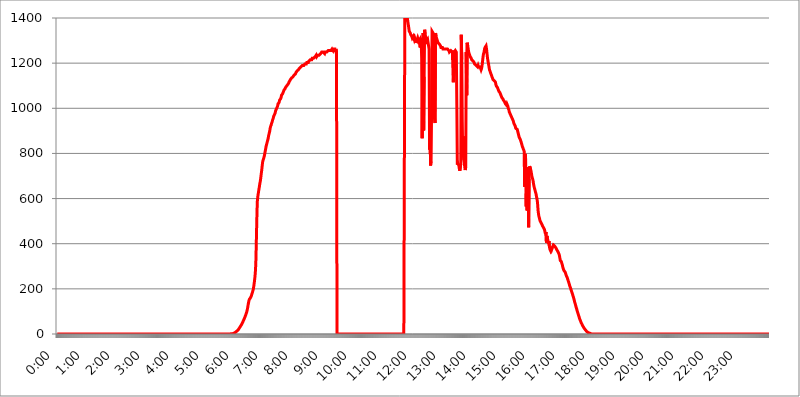
| Category | 2015.03.06. Intenzitás [W/m^2] |
|---|---|
| 0.0 | -0.256 |
| 0.0006944444444444445 | -0.256 |
| 0.001388888888888889 | -0.256 |
| 0.0020833333333333333 | -0.256 |
| 0.002777777777777778 | -0.256 |
| 0.003472222222222222 | -0.256 |
| 0.004166666666666667 | -0.256 |
| 0.004861111111111111 | -0.256 |
| 0.005555555555555556 | -0.256 |
| 0.0062499999999999995 | -0.256 |
| 0.006944444444444444 | -0.256 |
| 0.007638888888888889 | -0.256 |
| 0.008333333333333333 | -0.256 |
| 0.009027777777777779 | -0.256 |
| 0.009722222222222222 | -0.256 |
| 0.010416666666666666 | -0.256 |
| 0.011111111111111112 | -0.256 |
| 0.011805555555555555 | -0.256 |
| 0.012499999999999999 | -0.256 |
| 0.013194444444444444 | -0.256 |
| 0.013888888888888888 | -0.256 |
| 0.014583333333333332 | -0.256 |
| 0.015277777777777777 | -0.256 |
| 0.015972222222222224 | -0.256 |
| 0.016666666666666666 | -0.256 |
| 0.017361111111111112 | -0.256 |
| 0.018055555555555557 | -0.256 |
| 0.01875 | -0.256 |
| 0.019444444444444445 | -0.256 |
| 0.02013888888888889 | -0.256 |
| 0.020833333333333332 | -0.256 |
| 0.02152777777777778 | -0.256 |
| 0.022222222222222223 | -0.256 |
| 0.02291666666666667 | -0.256 |
| 0.02361111111111111 | -0.256 |
| 0.024305555555555556 | -0.256 |
| 0.024999999999999998 | -0.256 |
| 0.025694444444444447 | -0.256 |
| 0.02638888888888889 | -0.256 |
| 0.027083333333333334 | -0.256 |
| 0.027777777777777776 | -0.256 |
| 0.02847222222222222 | -0.256 |
| 0.029166666666666664 | -0.256 |
| 0.029861111111111113 | -0.256 |
| 0.030555555555555555 | -0.256 |
| 0.03125 | -0.256 |
| 0.03194444444444445 | -0.256 |
| 0.03263888888888889 | -0.256 |
| 0.03333333333333333 | -0.256 |
| 0.034027777777777775 | -0.256 |
| 0.034722222222222224 | -0.256 |
| 0.035416666666666666 | -0.256 |
| 0.036111111111111115 | -0.256 |
| 0.03680555555555556 | -0.256 |
| 0.0375 | -0.256 |
| 0.03819444444444444 | -0.256 |
| 0.03888888888888889 | -0.256 |
| 0.03958333333333333 | -0.256 |
| 0.04027777777777778 | -0.256 |
| 0.04097222222222222 | -0.256 |
| 0.041666666666666664 | -0.256 |
| 0.042361111111111106 | -0.256 |
| 0.04305555555555556 | -0.256 |
| 0.043750000000000004 | -0.256 |
| 0.044444444444444446 | -0.256 |
| 0.04513888888888889 | -0.256 |
| 0.04583333333333334 | -0.256 |
| 0.04652777777777778 | -0.256 |
| 0.04722222222222222 | -0.256 |
| 0.04791666666666666 | -0.256 |
| 0.04861111111111111 | -0.256 |
| 0.049305555555555554 | -0.256 |
| 0.049999999999999996 | -0.256 |
| 0.05069444444444445 | -0.256 |
| 0.051388888888888894 | -0.256 |
| 0.052083333333333336 | -0.256 |
| 0.05277777777777778 | -0.256 |
| 0.05347222222222222 | -0.256 |
| 0.05416666666666667 | -0.256 |
| 0.05486111111111111 | -0.256 |
| 0.05555555555555555 | -0.256 |
| 0.05625 | -0.256 |
| 0.05694444444444444 | -0.256 |
| 0.057638888888888885 | -0.256 |
| 0.05833333333333333 | -0.256 |
| 0.05902777777777778 | -0.256 |
| 0.059722222222222225 | -0.256 |
| 0.06041666666666667 | -0.256 |
| 0.061111111111111116 | -0.256 |
| 0.06180555555555556 | -0.256 |
| 0.0625 | -0.256 |
| 0.06319444444444444 | -0.256 |
| 0.06388888888888888 | -0.256 |
| 0.06458333333333334 | -0.256 |
| 0.06527777777777778 | -0.256 |
| 0.06597222222222222 | -0.256 |
| 0.06666666666666667 | -0.256 |
| 0.06736111111111111 | -0.256 |
| 0.06805555555555555 | -0.256 |
| 0.06874999999999999 | -0.256 |
| 0.06944444444444443 | -0.256 |
| 0.07013888888888889 | -0.256 |
| 0.07083333333333333 | -0.256 |
| 0.07152777777777779 | -0.256 |
| 0.07222222222222223 | -0.256 |
| 0.07291666666666667 | -0.256 |
| 0.07361111111111111 | -0.256 |
| 0.07430555555555556 | -0.256 |
| 0.075 | -0.256 |
| 0.07569444444444444 | -0.256 |
| 0.0763888888888889 | -0.256 |
| 0.07708333333333334 | -0.256 |
| 0.07777777777777778 | -0.256 |
| 0.07847222222222222 | -0.256 |
| 0.07916666666666666 | -0.256 |
| 0.0798611111111111 | -0.256 |
| 0.08055555555555556 | -0.256 |
| 0.08125 | -0.256 |
| 0.08194444444444444 | -0.256 |
| 0.08263888888888889 | -0.256 |
| 0.08333333333333333 | -0.256 |
| 0.08402777777777777 | -0.256 |
| 0.08472222222222221 | -0.256 |
| 0.08541666666666665 | -0.256 |
| 0.08611111111111112 | -0.256 |
| 0.08680555555555557 | -0.256 |
| 0.08750000000000001 | -0.256 |
| 0.08819444444444445 | -0.256 |
| 0.08888888888888889 | -0.256 |
| 0.08958333333333333 | -0.256 |
| 0.09027777777777778 | -0.256 |
| 0.09097222222222222 | -0.256 |
| 0.09166666666666667 | -0.256 |
| 0.09236111111111112 | -0.256 |
| 0.09305555555555556 | -0.256 |
| 0.09375 | -0.256 |
| 0.09444444444444444 | -0.256 |
| 0.09513888888888888 | -0.256 |
| 0.09583333333333333 | -0.256 |
| 0.09652777777777777 | -0.256 |
| 0.09722222222222222 | -0.256 |
| 0.09791666666666667 | -0.256 |
| 0.09861111111111111 | -0.256 |
| 0.09930555555555555 | -0.256 |
| 0.09999999999999999 | -0.256 |
| 0.10069444444444443 | -0.256 |
| 0.1013888888888889 | -0.256 |
| 0.10208333333333335 | -0.256 |
| 0.10277777777777779 | -0.256 |
| 0.10347222222222223 | -0.256 |
| 0.10416666666666667 | -0.256 |
| 0.10486111111111111 | -0.256 |
| 0.10555555555555556 | -0.256 |
| 0.10625 | -0.256 |
| 0.10694444444444444 | -0.256 |
| 0.1076388888888889 | -0.256 |
| 0.10833333333333334 | -0.256 |
| 0.10902777777777778 | -0.256 |
| 0.10972222222222222 | -0.256 |
| 0.1111111111111111 | -0.256 |
| 0.11180555555555556 | -0.256 |
| 0.11180555555555556 | -0.256 |
| 0.1125 | -0.256 |
| 0.11319444444444444 | -0.256 |
| 0.11388888888888889 | -0.256 |
| 0.11458333333333333 | -0.256 |
| 0.11527777777777777 | -0.256 |
| 0.11597222222222221 | -0.256 |
| 0.11666666666666665 | -0.256 |
| 0.1173611111111111 | -0.256 |
| 0.11805555555555557 | -0.256 |
| 0.11944444444444445 | -0.256 |
| 0.12013888888888889 | -0.256 |
| 0.12083333333333333 | -0.256 |
| 0.12152777777777778 | -0.256 |
| 0.12222222222222223 | -0.256 |
| 0.12291666666666667 | -0.256 |
| 0.12291666666666667 | -0.256 |
| 0.12361111111111112 | -0.256 |
| 0.12430555555555556 | -0.256 |
| 0.125 | -0.256 |
| 0.12569444444444444 | -0.256 |
| 0.12638888888888888 | -0.256 |
| 0.12708333333333333 | -0.256 |
| 0.16875 | -0.256 |
| 0.12847222222222224 | -0.256 |
| 0.12916666666666668 | -0.256 |
| 0.12986111111111112 | -0.256 |
| 0.13055555555555556 | -0.256 |
| 0.13125 | -0.256 |
| 0.13194444444444445 | -0.256 |
| 0.1326388888888889 | -0.256 |
| 0.13333333333333333 | -0.256 |
| 0.13402777777777777 | -0.256 |
| 0.13402777777777777 | -0.256 |
| 0.13472222222222222 | -0.256 |
| 0.13541666666666666 | -0.256 |
| 0.1361111111111111 | -0.256 |
| 0.13749999999999998 | -0.256 |
| 0.13819444444444443 | -0.256 |
| 0.1388888888888889 | -0.256 |
| 0.13958333333333334 | -0.256 |
| 0.14027777777777778 | -0.256 |
| 0.14097222222222222 | -0.256 |
| 0.14166666666666666 | -0.256 |
| 0.1423611111111111 | -0.256 |
| 0.14305555555555557 | -0.256 |
| 0.14375000000000002 | -0.256 |
| 0.14444444444444446 | -0.256 |
| 0.1451388888888889 | -0.256 |
| 0.1451388888888889 | -0.256 |
| 0.14652777777777778 | -0.256 |
| 0.14722222222222223 | -0.256 |
| 0.14791666666666667 | -0.256 |
| 0.1486111111111111 | -0.256 |
| 0.14930555555555555 | -0.256 |
| 0.15 | -0.256 |
| 0.15069444444444444 | -0.256 |
| 0.15138888888888888 | -0.256 |
| 0.15208333333333332 | -0.256 |
| 0.15277777777777776 | -0.256 |
| 0.15347222222222223 | -0.256 |
| 0.15416666666666667 | -0.256 |
| 0.15486111111111112 | -0.256 |
| 0.15555555555555556 | -0.256 |
| 0.15625 | -0.256 |
| 0.15694444444444444 | -0.256 |
| 0.15763888888888888 | -0.256 |
| 0.15833333333333333 | -0.256 |
| 0.15902777777777777 | -0.256 |
| 0.15972222222222224 | -0.256 |
| 0.16041666666666668 | -0.256 |
| 0.16111111111111112 | -0.256 |
| 0.16180555555555556 | -0.256 |
| 0.1625 | -0.256 |
| 0.16319444444444445 | -0.256 |
| 0.1638888888888889 | -0.256 |
| 0.16458333333333333 | -0.256 |
| 0.16527777777777777 | -0.256 |
| 0.16597222222222222 | -0.256 |
| 0.16666666666666666 | -0.256 |
| 0.1673611111111111 | -0.256 |
| 0.16805555555555554 | -0.256 |
| 0.16874999999999998 | -0.256 |
| 0.16944444444444443 | -0.256 |
| 0.17013888888888887 | -0.256 |
| 0.1708333333333333 | -0.256 |
| 0.17152777777777775 | -0.256 |
| 0.17222222222222225 | -0.256 |
| 0.1729166666666667 | -0.256 |
| 0.17361111111111113 | -0.256 |
| 0.17430555555555557 | -0.256 |
| 0.17500000000000002 | -0.256 |
| 0.17569444444444446 | -0.256 |
| 0.1763888888888889 | -0.256 |
| 0.17708333333333334 | -0.256 |
| 0.17777777777777778 | -0.256 |
| 0.17847222222222223 | -0.256 |
| 0.17916666666666667 | -0.256 |
| 0.1798611111111111 | -0.256 |
| 0.18055555555555555 | -0.256 |
| 0.18125 | -0.256 |
| 0.18194444444444444 | -0.256 |
| 0.1826388888888889 | -0.256 |
| 0.18333333333333335 | -0.256 |
| 0.1840277777777778 | -0.256 |
| 0.18472222222222223 | -0.256 |
| 0.18541666666666667 | -0.256 |
| 0.18611111111111112 | -0.256 |
| 0.18680555555555556 | -0.256 |
| 0.1875 | -0.256 |
| 0.18819444444444444 | -0.256 |
| 0.18888888888888888 | -0.256 |
| 0.18958333333333333 | -0.256 |
| 0.19027777777777777 | -0.256 |
| 0.1909722222222222 | -0.256 |
| 0.19166666666666665 | -0.256 |
| 0.19236111111111112 | -0.256 |
| 0.19305555555555554 | -0.256 |
| 0.19375 | -0.256 |
| 0.19444444444444445 | -0.256 |
| 0.1951388888888889 | -0.256 |
| 0.19583333333333333 | -0.256 |
| 0.19652777777777777 | -0.256 |
| 0.19722222222222222 | -0.256 |
| 0.19791666666666666 | -0.256 |
| 0.1986111111111111 | -0.256 |
| 0.19930555555555554 | -0.256 |
| 0.19999999999999998 | -0.256 |
| 0.20069444444444443 | -0.256 |
| 0.20138888888888887 | -0.256 |
| 0.2020833333333333 | -0.256 |
| 0.2027777777777778 | -0.256 |
| 0.2034722222222222 | -0.256 |
| 0.2041666666666667 | -0.256 |
| 0.20486111111111113 | -0.256 |
| 0.20555555555555557 | -0.256 |
| 0.20625000000000002 | -0.256 |
| 0.20694444444444446 | -0.256 |
| 0.2076388888888889 | -0.256 |
| 0.20833333333333334 | -0.256 |
| 0.20902777777777778 | -0.256 |
| 0.20972222222222223 | -0.256 |
| 0.21041666666666667 | -0.256 |
| 0.2111111111111111 | -0.256 |
| 0.21180555555555555 | -0.256 |
| 0.2125 | -0.256 |
| 0.21319444444444444 | -0.256 |
| 0.2138888888888889 | -0.256 |
| 0.21458333333333335 | -0.256 |
| 0.2152777777777778 | -0.256 |
| 0.21597222222222223 | -0.256 |
| 0.21666666666666667 | -0.256 |
| 0.21736111111111112 | -0.256 |
| 0.21805555555555556 | -0.256 |
| 0.21875 | -0.256 |
| 0.21944444444444444 | -0.256 |
| 0.22013888888888888 | -0.256 |
| 0.22083333333333333 | -0.256 |
| 0.22152777777777777 | -0.256 |
| 0.2222222222222222 | -0.256 |
| 0.22291666666666665 | -0.256 |
| 0.2236111111111111 | -0.256 |
| 0.22430555555555556 | -0.256 |
| 0.225 | -0.256 |
| 0.22569444444444445 | -0.256 |
| 0.2263888888888889 | -0.256 |
| 0.22708333333333333 | -0.256 |
| 0.22777777777777777 | -0.256 |
| 0.22847222222222222 | -0.256 |
| 0.22916666666666666 | -0.256 |
| 0.2298611111111111 | -0.256 |
| 0.23055555555555554 | -0.256 |
| 0.23124999999999998 | -0.256 |
| 0.23194444444444443 | -0.256 |
| 0.23263888888888887 | -0.256 |
| 0.2333333333333333 | -0.256 |
| 0.2340277777777778 | -0.256 |
| 0.2347222222222222 | -0.256 |
| 0.2354166666666667 | -0.256 |
| 0.23611111111111113 | -0.256 |
| 0.23680555555555557 | -0.256 |
| 0.23750000000000002 | -0.256 |
| 0.23819444444444446 | -0.256 |
| 0.2388888888888889 | -0.256 |
| 0.23958333333333334 | -0.256 |
| 0.24027777777777778 | -0.256 |
| 0.24097222222222223 | -0.256 |
| 0.24166666666666667 | -0.256 |
| 0.2423611111111111 | -0.256 |
| 0.24305555555555555 | -0.256 |
| 0.24375 | 1.09 |
| 0.24444444444444446 | 1.09 |
| 0.24513888888888888 | 1.09 |
| 0.24583333333333335 | 1.09 |
| 0.2465277777777778 | 2.439 |
| 0.24722222222222223 | 2.439 |
| 0.24791666666666667 | 3.791 |
| 0.24861111111111112 | 5.146 |
| 0.24930555555555556 | 6.503 |
| 0.25 | 7.862 |
| 0.25069444444444444 | 9.225 |
| 0.2513888888888889 | 10.589 |
| 0.2520833333333333 | 13.325 |
| 0.25277777777777777 | 14.696 |
| 0.2534722222222222 | 17.444 |
| 0.25416666666666665 | 20.201 |
| 0.2548611111111111 | 22.965 |
| 0.2555555555555556 | 27.124 |
| 0.25625000000000003 | 29.905 |
| 0.2569444444444445 | 34.086 |
| 0.2576388888888889 | 36.881 |
| 0.25833333333333336 | 41.081 |
| 0.2590277777777778 | 45.29 |
| 0.25972222222222224 | 49.507 |
| 0.2604166666666667 | 53.73 |
| 0.2611111111111111 | 59.368 |
| 0.26180555555555557 | 63.6 |
| 0.2625 | 69.246 |
| 0.26319444444444445 | 74.892 |
| 0.2638888888888889 | 80.536 |
| 0.26458333333333334 | 86.175 |
| 0.2652777777777778 | 93.212 |
| 0.2659722222222222 | 100.233 |
| 0.26666666666666666 | 110.025 |
| 0.2673611111111111 | 122.538 |
| 0.26805555555555555 | 134.943 |
| 0.26875 | 145.865 |
| 0.26944444444444443 | 153.986 |
| 0.2701388888888889 | 156.678 |
| 0.2708333333333333 | 159.364 |
| 0.27152777777777776 | 162.042 |
| 0.2722222222222222 | 168.703 |
| 0.27291666666666664 | 176.631 |
| 0.2736111111111111 | 183.184 |
| 0.2743055555555555 | 190.979 |
| 0.27499999999999997 | 198.701 |
| 0.27569444444444446 | 212.664 |
| 0.27638888888888885 | 228.852 |
| 0.27708333333333335 | 247.131 |
| 0.2777777777777778 | 270.931 |
| 0.27847222222222223 | 310.439 |
| 0.2791666666666667 | 400.943 |
| 0.2798611111111111 | 502.396 |
| 0.28055555555555556 | 585.562 |
| 0.28125 | 607.495 |
| 0.28194444444444444 | 622.881 |
| 0.2826388888888889 | 636.194 |
| 0.2833333333333333 | 649.973 |
| 0.28402777777777777 | 664.234 |
| 0.2847222222222222 | 676.003 |
| 0.28541666666666665 | 691.18 |
| 0.28611111111111115 | 710.098 |
| 0.28680555555555554 | 726.474 |
| 0.28750000000000003 | 746.886 |
| 0.2881944444444445 | 764.555 |
| 0.2888888888888889 | 771.794 |
| 0.28958333333333336 | 779.134 |
| 0.2902777777777778 | 786.575 |
| 0.29097222222222224 | 797.931 |
| 0.2916666666666667 | 809.522 |
| 0.2923611111111111 | 821.353 |
| 0.29305555555555557 | 833.43 |
| 0.29375 | 837.51 |
| 0.29444444444444445 | 849.92 |
| 0.2951388888888889 | 858.335 |
| 0.29583333333333334 | 866.865 |
| 0.2965277777777778 | 879.878 |
| 0.2972222222222222 | 888.701 |
| 0.29791666666666666 | 897.643 |
| 0.2986111111111111 | 911.285 |
| 0.29930555555555555 | 920.533 |
| 0.3 | 925.203 |
| 0.30069444444444443 | 934.639 |
| 0.3013888888888889 | 939.404 |
| 0.3020833333333333 | 949.03 |
| 0.30277777777777776 | 953.892 |
| 0.3034722222222222 | 963.712 |
| 0.30416666666666664 | 968.671 |
| 0.3048611111111111 | 973.663 |
| 0.3055555555555555 | 978.688 |
| 0.30624999999999997 | 988.839 |
| 0.3069444444444444 | 993.965 |
| 0.3076388888888889 | 999.125 |
| 0.30833333333333335 | 1004.318 |
| 0.3090277777777778 | 1009.546 |
| 0.30972222222222223 | 1020.106 |
| 0.3104166666666667 | 1020.106 |
| 0.3111111111111111 | 1025.437 |
| 0.31180555555555556 | 1036.206 |
| 0.3125 | 1036.206 |
| 0.31319444444444444 | 1041.644 |
| 0.3138888888888889 | 1047.117 |
| 0.3145833333333333 | 1058.17 |
| 0.31527777777777777 | 1058.17 |
| 0.3159722222222222 | 1063.751 |
| 0.31666666666666665 | 1069.368 |
| 0.31736111111111115 | 1075.021 |
| 0.31805555555555554 | 1080.711 |
| 0.31875000000000003 | 1080.711 |
| 0.3194444444444445 | 1086.439 |
| 0.3201388888888889 | 1092.203 |
| 0.32083333333333336 | 1092.203 |
| 0.3215277777777778 | 1098.004 |
| 0.32222222222222224 | 1098.004 |
| 0.3229166666666667 | 1103.843 |
| 0.3236111111111111 | 1103.843 |
| 0.32430555555555557 | 1109.72 |
| 0.325 | 1115.634 |
| 0.32569444444444445 | 1115.634 |
| 0.3263888888888889 | 1115.634 |
| 0.32708333333333334 | 1127.578 |
| 0.3277777777777778 | 1127.578 |
| 0.3284722222222222 | 1133.607 |
| 0.32916666666666666 | 1133.607 |
| 0.3298611111111111 | 1133.607 |
| 0.33055555555555555 | 1139.675 |
| 0.33125 | 1139.675 |
| 0.33194444444444443 | 1145.782 |
| 0.3326388888888889 | 1145.782 |
| 0.3333333333333333 | 1145.782 |
| 0.3340277777777778 | 1151.928 |
| 0.3347222222222222 | 1158.113 |
| 0.3354166666666667 | 1158.113 |
| 0.3361111111111111 | 1164.337 |
| 0.3368055555555556 | 1164.337 |
| 0.33749999999999997 | 1164.337 |
| 0.33819444444444446 | 1170.601 |
| 0.33888888888888885 | 1170.601 |
| 0.33958333333333335 | 1176.905 |
| 0.34027777777777773 | 1176.905 |
| 0.34097222222222223 | 1176.905 |
| 0.3416666666666666 | 1183.249 |
| 0.3423611111111111 | 1183.249 |
| 0.3430555555555555 | 1183.249 |
| 0.34375 | 1189.633 |
| 0.3444444444444445 | 1189.633 |
| 0.3451388888888889 | 1189.633 |
| 0.3458333333333334 | 1189.633 |
| 0.34652777777777777 | 1189.633 |
| 0.34722222222222227 | 1196.058 |
| 0.34791666666666665 | 1196.058 |
| 0.34861111111111115 | 1196.058 |
| 0.34930555555555554 | 1196.058 |
| 0.35000000000000003 | 1202.523 |
| 0.3506944444444444 | 1202.523 |
| 0.3513888888888889 | 1202.523 |
| 0.3520833333333333 | 1202.523 |
| 0.3527777777777778 | 1209.029 |
| 0.3534722222222222 | 1209.029 |
| 0.3541666666666667 | 1209.029 |
| 0.3548611111111111 | 1215.576 |
| 0.35555555555555557 | 1215.576 |
| 0.35625 | 1215.576 |
| 0.35694444444444445 | 1215.576 |
| 0.3576388888888889 | 1222.164 |
| 0.35833333333333334 | 1222.164 |
| 0.3590277777777778 | 1222.164 |
| 0.3597222222222222 | 1222.164 |
| 0.36041666666666666 | 1222.164 |
| 0.3611111111111111 | 1222.164 |
| 0.36180555555555555 | 1228.794 |
| 0.3625 | 1228.794 |
| 0.36319444444444443 | 1235.465 |
| 0.3638888888888889 | 1228.794 |
| 0.3645833333333333 | 1228.794 |
| 0.3652777777777778 | 1235.465 |
| 0.3659722222222222 | 1235.465 |
| 0.3666666666666667 | 1235.465 |
| 0.3673611111111111 | 1235.465 |
| 0.3680555555555556 | 1235.465 |
| 0.36874999999999997 | 1235.465 |
| 0.36944444444444446 | 1242.179 |
| 0.37013888888888885 | 1242.179 |
| 0.37083333333333335 | 1248.934 |
| 0.37152777777777773 | 1248.934 |
| 0.37222222222222223 | 1248.934 |
| 0.3729166666666666 | 1248.934 |
| 0.3736111111111111 | 1248.934 |
| 0.3743055555555555 | 1248.934 |
| 0.375 | 1242.179 |
| 0.3756944444444445 | 1248.934 |
| 0.3763888888888889 | 1248.934 |
| 0.3770833333333334 | 1248.934 |
| 0.37777777777777777 | 1248.934 |
| 0.37847222222222227 | 1248.934 |
| 0.37916666666666665 | 1248.934 |
| 0.37986111111111115 | 1255.731 |
| 0.38055555555555554 | 1255.731 |
| 0.38125000000000003 | 1255.731 |
| 0.3819444444444444 | 1255.731 |
| 0.3826388888888889 | 1255.731 |
| 0.3833333333333333 | 1255.731 |
| 0.3840277777777778 | 1255.731 |
| 0.3847222222222222 | 1255.731 |
| 0.3854166666666667 | 1262.571 |
| 0.3861111111111111 | 1262.571 |
| 0.38680555555555557 | 1255.731 |
| 0.3875 | 1262.571 |
| 0.38819444444444445 | 1262.571 |
| 0.3888888888888889 | 1262.571 |
| 0.38958333333333334 | 1262.571 |
| 0.3902777777777778 | 1255.731 |
| 0.3909722222222222 | 1262.571 |
| 0.39166666666666666 | 1248.934 |
| 0.3923611111111111 | -0.256 |
| 0.39305555555555555 | -0.256 |
| 0.39375 | -0.256 |
| 0.39444444444444443 | -0.256 |
| 0.3951388888888889 | -0.256 |
| 0.3958333333333333 | -0.256 |
| 0.3965277777777778 | -0.256 |
| 0.3972222222222222 | -0.256 |
| 0.3979166666666667 | -0.256 |
| 0.3986111111111111 | -0.256 |
| 0.3993055555555556 | -0.256 |
| 0.39999999999999997 | -0.256 |
| 0.40069444444444446 | -0.256 |
| 0.40138888888888885 | -0.256 |
| 0.40208333333333335 | -0.256 |
| 0.40277777777777773 | -0.256 |
| 0.40347222222222223 | -0.256 |
| 0.4041666666666666 | -0.256 |
| 0.4048611111111111 | -0.256 |
| 0.4055555555555555 | -0.256 |
| 0.40625 | -0.256 |
| 0.4069444444444445 | -0.256 |
| 0.4076388888888889 | -0.256 |
| 0.4083333333333334 | -0.256 |
| 0.40902777777777777 | -0.256 |
| 0.40972222222222227 | -0.256 |
| 0.41041666666666665 | -0.256 |
| 0.41111111111111115 | -0.256 |
| 0.41180555555555554 | -0.256 |
| 0.41250000000000003 | -0.256 |
| 0.4131944444444444 | -0.256 |
| 0.4138888888888889 | -0.256 |
| 0.4145833333333333 | -0.256 |
| 0.4152777777777778 | -0.256 |
| 0.4159722222222222 | -0.256 |
| 0.4166666666666667 | -0.256 |
| 0.4173611111111111 | -0.256 |
| 0.41805555555555557 | -0.256 |
| 0.41875 | -0.256 |
| 0.41944444444444445 | -0.256 |
| 0.4201388888888889 | -0.256 |
| 0.42083333333333334 | -0.256 |
| 0.4215277777777778 | -0.256 |
| 0.4222222222222222 | -0.256 |
| 0.42291666666666666 | -0.256 |
| 0.4236111111111111 | -0.256 |
| 0.42430555555555555 | -0.256 |
| 0.425 | -0.256 |
| 0.42569444444444443 | -0.256 |
| 0.4263888888888889 | -0.256 |
| 0.4270833333333333 | -0.256 |
| 0.4277777777777778 | -0.256 |
| 0.4284722222222222 | -0.256 |
| 0.4291666666666667 | -0.256 |
| 0.4298611111111111 | -0.256 |
| 0.4305555555555556 | -0.256 |
| 0.43124999999999997 | -0.256 |
| 0.43194444444444446 | -0.256 |
| 0.43263888888888885 | -0.256 |
| 0.43333333333333335 | -0.256 |
| 0.43402777777777773 | -0.256 |
| 0.43472222222222223 | -0.256 |
| 0.4354166666666666 | -0.256 |
| 0.4361111111111111 | -0.256 |
| 0.4368055555555555 | -0.256 |
| 0.4375 | -0.256 |
| 0.4381944444444445 | -0.256 |
| 0.4388888888888889 | -0.256 |
| 0.4395833333333334 | -0.256 |
| 0.44027777777777777 | -0.256 |
| 0.44097222222222227 | -0.256 |
| 0.44166666666666665 | -0.256 |
| 0.44236111111111115 | -0.256 |
| 0.44305555555555554 | -0.256 |
| 0.44375000000000003 | -0.256 |
| 0.4444444444444444 | -0.256 |
| 0.4451388888888889 | -0.256 |
| 0.4458333333333333 | -0.256 |
| 0.4465277777777778 | -0.256 |
| 0.4472222222222222 | -0.256 |
| 0.4479166666666667 | -0.256 |
| 0.4486111111111111 | -0.256 |
| 0.44930555555555557 | -0.256 |
| 0.45 | -0.256 |
| 0.45069444444444445 | -0.256 |
| 0.4513888888888889 | -0.256 |
| 0.45208333333333334 | -0.256 |
| 0.4527777777777778 | -0.256 |
| 0.4534722222222222 | -0.256 |
| 0.45416666666666666 | -0.256 |
| 0.4548611111111111 | -0.256 |
| 0.45555555555555555 | -0.256 |
| 0.45625 | -0.256 |
| 0.45694444444444443 | -0.256 |
| 0.4576388888888889 | -0.256 |
| 0.4583333333333333 | -0.256 |
| 0.4590277777777778 | -0.256 |
| 0.4597222222222222 | -0.256 |
| 0.4604166666666667 | -0.256 |
| 0.4611111111111111 | -0.256 |
| 0.4618055555555556 | -0.256 |
| 0.46249999999999997 | -0.256 |
| 0.46319444444444446 | -0.256 |
| 0.46388888888888885 | -0.256 |
| 0.46458333333333335 | -0.256 |
| 0.46527777777777773 | -0.256 |
| 0.46597222222222223 | -0.256 |
| 0.4666666666666666 | -0.256 |
| 0.4673611111111111 | -0.256 |
| 0.4680555555555555 | -0.256 |
| 0.46875 | -0.256 |
| 0.4694444444444445 | -0.256 |
| 0.4701388888888889 | -0.256 |
| 0.4708333333333334 | -0.256 |
| 0.47152777777777777 | -0.256 |
| 0.47222222222222227 | -0.256 |
| 0.47291666666666665 | -0.256 |
| 0.47361111111111115 | -0.256 |
| 0.47430555555555554 | -0.256 |
| 0.47500000000000003 | -0.256 |
| 0.4756944444444444 | -0.256 |
| 0.4763888888888889 | -0.256 |
| 0.4770833333333333 | -0.256 |
| 0.4777777777777778 | -0.256 |
| 0.4784722222222222 | -0.256 |
| 0.4791666666666667 | -0.256 |
| 0.4798611111111111 | -0.256 |
| 0.48055555555555557 | -0.256 |
| 0.48125 | -0.256 |
| 0.48194444444444445 | -0.256 |
| 0.4826388888888889 | -0.256 |
| 0.48333333333333334 | -0.256 |
| 0.4840277777777778 | -0.256 |
| 0.4847222222222222 | -0.256 |
| 0.48541666666666666 | -0.256 |
| 0.4861111111111111 | -0.256 |
| 0.48680555555555555 | -0.256 |
| 0.4875 | 1447.982 |
| 0.48819444444444443 | 1447.982 |
| 0.4888888888888889 | 1447.982 |
| 0.4895833333333333 | 1447.982 |
| 0.4902777777777778 | 1424.216 |
| 0.4909722222222222 | 1400.876 |
| 0.4916666666666667 | 1385.549 |
| 0.4923611111111111 | 1370.408 |
| 0.4930555555555556 | 1355.45 |
| 0.49374999999999997 | 1340.673 |
| 0.49444444444444446 | 1340.673 |
| 0.49513888888888885 | 1333.352 |
| 0.49583333333333335 | 1326.076 |
| 0.49652777777777773 | 1326.076 |
| 0.49722222222222223 | 1318.845 |
| 0.4979166666666666 | 1311.658 |
| 0.4986111111111111 | 1311.658 |
| 0.4993055555555555 | 1318.845 |
| 0.5 | 1311.658 |
| 0.5006944444444444 | 1304.515 |
| 0.5013888888888889 | 1311.658 |
| 0.5020833333333333 | 1304.515 |
| 0.5027777777777778 | 1290.36 |
| 0.5034722222222222 | 1290.36 |
| 0.5041666666666667 | 1311.658 |
| 0.5048611111111111 | 1304.515 |
| 0.5055555555555555 | 1311.658 |
| 0.50625 | 1304.515 |
| 0.5069444444444444 | 1297.416 |
| 0.5076388888888889 | 1297.416 |
| 0.5083333333333333 | 1304.515 |
| 0.5090277777777777 | 1269.454 |
| 0.5097222222222222 | 1311.658 |
| 0.5104166666666666 | 1304.515 |
| 0.5111111111111112 | 1222.164 |
| 0.5118055555555555 | 866.865 |
| 0.5125000000000001 | 1183.249 |
| 0.5131944444444444 | 1333.352 |
| 0.513888888888889 | 902.16 |
| 0.5145833333333333 | 1139.675 |
| 0.5152777777777778 | 1348.039 |
| 0.5159722222222222 | 1326.076 |
| 0.5166666666666667 | 1318.845 |
| 0.517361111111111 | 1304.515 |
| 0.5180555555555556 | 1297.416 |
| 0.5187499999999999 | 1297.416 |
| 0.5194444444444445 | 1304.515 |
| 0.5201388888888888 | 1290.36 |
| 0.5208333333333334 | 1290.36 |
| 0.5215277777777778 | 1262.571 |
| 0.5222222222222223 | 817.382 |
| 0.5229166666666667 | 866.865 |
| 0.5236111111111111 | 746.886 |
| 0.5243055555555556 | 764.555 |
| 0.525 | 978.688 |
| 0.5256944444444445 | 1340.673 |
| 0.5263888888888889 | 1340.673 |
| 0.5270833333333333 | 1333.352 |
| 0.5277777777777778 | 1304.515 |
| 0.5284722222222222 | 1036.206 |
| 0.5291666666666667 | 953.892 |
| 0.5298611111111111 | 934.639 |
| 0.5305555555555556 | 1333.352 |
| 0.53125 | 1318.845 |
| 0.5319444444444444 | 1311.658 |
| 0.5326388888888889 | 1304.515 |
| 0.5333333333333333 | 1297.416 |
| 0.5340277777777778 | 1290.36 |
| 0.5347222222222222 | 1290.36 |
| 0.5354166666666667 | 1290.36 |
| 0.5361111111111111 | 1283.348 |
| 0.5368055555555555 | 1283.348 |
| 0.5375 | 1276.38 |
| 0.5381944444444444 | 1269.454 |
| 0.5388888888888889 | 1269.454 |
| 0.5395833333333333 | 1269.454 |
| 0.5402777777777777 | 1269.454 |
| 0.5409722222222222 | 1262.571 |
| 0.5416666666666666 | 1262.571 |
| 0.5423611111111112 | 1262.571 |
| 0.5430555555555555 | 1262.571 |
| 0.5437500000000001 | 1262.571 |
| 0.5444444444444444 | 1262.571 |
| 0.545138888888889 | 1262.571 |
| 0.5458333333333333 | 1262.571 |
| 0.5465277777777778 | 1262.571 |
| 0.5472222222222222 | 1262.571 |
| 0.5479166666666667 | 1262.571 |
| 0.548611111111111 | 1262.571 |
| 0.5493055555555556 | 1255.731 |
| 0.5499999999999999 | 1248.934 |
| 0.5506944444444445 | 1248.934 |
| 0.5513888888888888 | 1248.934 |
| 0.5520833333333334 | 1255.731 |
| 0.5527777777777778 | 1255.731 |
| 0.5534722222222223 | 1255.731 |
| 0.5541666666666667 | 1248.934 |
| 0.5548611111111111 | 1248.934 |
| 0.5555555555555556 | 1115.634 |
| 0.55625 | 1255.731 |
| 0.5569444444444445 | 1248.934 |
| 0.5576388888888889 | 1248.934 |
| 0.5583333333333333 | 1255.731 |
| 0.5590277777777778 | 1255.731 |
| 0.5597222222222222 | 1248.934 |
| 0.5604166666666667 | 1014.809 |
| 0.5611111111111111 | 750.371 |
| 0.5618055555555556 | 757.414 |
| 0.5625 | 760.972 |
| 0.5631944444444444 | 746.886 |
| 0.5638888888888889 | 733.184 |
| 0.5645833333333333 | 723.153 |
| 0.5652777777777778 | 726.474 |
| 0.5659722222222222 | 753.881 |
| 0.5666666666666667 | 1326.076 |
| 0.5673611111111111 | 1215.576 |
| 0.5680555555555555 | 939.404 |
| 0.56875 | 782.842 |
| 0.5694444444444444 | 875.511 |
| 0.5701388888888889 | 771.794 |
| 0.5708333333333333 | 760.972 |
| 0.5715277777777777 | 739.988 |
| 0.5722222222222222 | 726.474 |
| 0.5729166666666666 | 739.988 |
| 0.5736111111111112 | 1248.934 |
| 0.5743055555555555 | 1058.17 |
| 0.5750000000000001 | 1290.36 |
| 0.5756944444444444 | 1276.38 |
| 0.576388888888889 | 1262.571 |
| 0.5770833333333333 | 1248.934 |
| 0.5777777777777778 | 1242.179 |
| 0.5784722222222222 | 1235.465 |
| 0.5791666666666667 | 1228.794 |
| 0.579861111111111 | 1228.794 |
| 0.5805555555555556 | 1222.164 |
| 0.5812499999999999 | 1215.576 |
| 0.5819444444444445 | 1215.576 |
| 0.5826388888888888 | 1215.576 |
| 0.5833333333333334 | 1209.029 |
| 0.5840277777777778 | 1209.029 |
| 0.5847222222222223 | 1202.523 |
| 0.5854166666666667 | 1196.058 |
| 0.5861111111111111 | 1196.058 |
| 0.5868055555555556 | 1196.058 |
| 0.5875 | 1189.633 |
| 0.5881944444444445 | 1189.633 |
| 0.5888888888888889 | 1189.633 |
| 0.5895833333333333 | 1183.249 |
| 0.5902777777777778 | 1189.633 |
| 0.5909722222222222 | 1183.249 |
| 0.5916666666666667 | 1183.249 |
| 0.5923611111111111 | 1183.249 |
| 0.5930555555555556 | 1183.249 |
| 0.59375 | 1176.905 |
| 0.5944444444444444 | 1170.601 |
| 0.5951388888888889 | 1176.905 |
| 0.5958333333333333 | 1189.633 |
| 0.5965277777777778 | 1209.029 |
| 0.5972222222222222 | 1228.794 |
| 0.5979166666666667 | 1242.179 |
| 0.5986111111111111 | 1248.934 |
| 0.5993055555555555 | 1262.571 |
| 0.6 | 1269.454 |
| 0.6006944444444444 | 1269.454 |
| 0.6013888888888889 | 1276.38 |
| 0.6020833333333333 | 1262.571 |
| 0.6027777777777777 | 1242.179 |
| 0.6034722222222222 | 1222.164 |
| 0.6041666666666666 | 1209.029 |
| 0.6048611111111112 | 1196.058 |
| 0.6055555555555555 | 1183.249 |
| 0.6062500000000001 | 1170.601 |
| 0.6069444444444444 | 1164.337 |
| 0.607638888888889 | 1158.113 |
| 0.6083333333333333 | 1151.928 |
| 0.6090277777777778 | 1145.782 |
| 0.6097222222222222 | 1139.675 |
| 0.6104166666666667 | 1133.607 |
| 0.611111111111111 | 1127.578 |
| 0.6118055555555556 | 1127.578 |
| 0.6124999999999999 | 1127.578 |
| 0.6131944444444445 | 1121.587 |
| 0.6138888888888888 | 1121.587 |
| 0.6145833333333334 | 1115.634 |
| 0.6152777777777778 | 1103.843 |
| 0.6159722222222223 | 1098.004 |
| 0.6166666666666667 | 1098.004 |
| 0.6173611111111111 | 1092.203 |
| 0.6180555555555556 | 1086.439 |
| 0.61875 | 1080.711 |
| 0.6194444444444445 | 1075.021 |
| 0.6201388888888889 | 1075.021 |
| 0.6208333333333333 | 1069.368 |
| 0.6215277777777778 | 1063.751 |
| 0.6222222222222222 | 1058.17 |
| 0.6229166666666667 | 1052.625 |
| 0.6236111111111111 | 1047.117 |
| 0.6243055555555556 | 1047.117 |
| 0.625 | 1041.644 |
| 0.6256944444444444 | 1036.206 |
| 0.6263888888888889 | 1036.206 |
| 0.6270833333333333 | 1030.804 |
| 0.6277777777777778 | 1025.437 |
| 0.6284722222222222 | 1020.106 |
| 0.6291666666666667 | 1020.106 |
| 0.6298611111111111 | 1014.809 |
| 0.6305555555555555 | 1020.106 |
| 0.63125 | 1014.809 |
| 0.6319444444444444 | 1009.546 |
| 0.6326388888888889 | 999.125 |
| 0.6333333333333333 | 993.965 |
| 0.6340277777777777 | 983.747 |
| 0.6347222222222222 | 978.688 |
| 0.6354166666666666 | 973.663 |
| 0.6361111111111112 | 973.663 |
| 0.6368055555555555 | 963.712 |
| 0.6375000000000001 | 963.712 |
| 0.6381944444444444 | 953.892 |
| 0.638888888888889 | 949.03 |
| 0.6395833333333333 | 944.201 |
| 0.6402777777777778 | 934.639 |
| 0.6409722222222222 | 929.905 |
| 0.6416666666666667 | 925.203 |
| 0.642361111111111 | 920.533 |
| 0.6430555555555556 | 911.285 |
| 0.6437499999999999 | 911.285 |
| 0.6444444444444445 | 911.285 |
| 0.6451388888888888 | 906.707 |
| 0.6458333333333334 | 897.643 |
| 0.6465277777777778 | 888.701 |
| 0.6472222222222223 | 879.878 |
| 0.6479166666666667 | 871.173 |
| 0.6486111111111111 | 866.865 |
| 0.6493055555555556 | 862.585 |
| 0.65 | 858.335 |
| 0.6506944444444445 | 849.92 |
| 0.6513888888888889 | 841.619 |
| 0.6520833333333333 | 833.43 |
| 0.6527777777777778 | 829.377 |
| 0.6534722222222222 | 821.353 |
| 0.6541666666666667 | 817.382 |
| 0.6548611111111111 | 809.522 |
| 0.6555555555555556 | 652.786 |
| 0.65625 | 797.931 |
| 0.6569444444444444 | 775.451 |
| 0.6576388888888889 | 564.917 |
| 0.6583333333333333 | 685.046 |
| 0.6590277777777778 | 547.572 |
| 0.6597222222222222 | 580.866 |
| 0.6604166666666667 | 739.988 |
| 0.6611111111111111 | 472.848 |
| 0.6618055555555555 | 688.102 |
| 0.6625 | 743.425 |
| 0.6631944444444444 | 739.988 |
| 0.6638888888888889 | 729.817 |
| 0.6645833333333333 | 719.855 |
| 0.6652777777777777 | 706.89 |
| 0.6659722222222222 | 694.278 |
| 0.6666666666666666 | 688.102 |
| 0.6673611111111111 | 678.997 |
| 0.6680555555555556 | 664.234 |
| 0.6687500000000001 | 652.786 |
| 0.6694444444444444 | 644.405 |
| 0.6701388888888888 | 636.194 |
| 0.6708333333333334 | 628.152 |
| 0.6715277777777778 | 620.273 |
| 0.6722222222222222 | 607.495 |
| 0.6729166666666666 | 597.582 |
| 0.6736111111111112 | 580.866 |
| 0.6743055555555556 | 549.691 |
| 0.6749999999999999 | 531.108 |
| 0.6756944444444444 | 519.3 |
| 0.6763888888888889 | 511.671 |
| 0.6770833333333334 | 502.396 |
| 0.6777777777777777 | 498.764 |
| 0.6784722222222223 | 493.398 |
| 0.6791666666666667 | 489.873 |
| 0.6798611111111111 | 484.662 |
| 0.6805555555555555 | 479.541 |
| 0.68125 | 476.176 |
| 0.6819444444444445 | 471.198 |
| 0.6826388888888889 | 467.925 |
| 0.6833333333333332 | 463.083 |
| 0.6840277777777778 | 459.898 |
| 0.6847222222222222 | 442.962 |
| 0.6854166666666667 | 452.082 |
| 0.686111111111111 | 404.916 |
| 0.6868055555555556 | 434.107 |
| 0.6875 | 431.211 |
| 0.6881944444444444 | 411.638 |
| 0.688888888888889 | 398.318 |
| 0.6895833333333333 | 411.638 |
| 0.6902777777777778 | 386.723 |
| 0.6909722222222222 | 375.442 |
| 0.6916666666666668 | 370.515 |
| 0.6923611111111111 | 366.851 |
| 0.6930555555555555 | 386.723 |
| 0.69375 | 376.682 |
| 0.6944444444444445 | 374.206 |
| 0.6951388888888889 | 389.27 |
| 0.6958333333333333 | 394.415 |
| 0.6965277777777777 | 391.834 |
| 0.6972222222222223 | 390.55 |
| 0.6979166666666666 | 387.995 |
| 0.6986111111111111 | 384.191 |
| 0.6993055555555556 | 381.674 |
| 0.7000000000000001 | 377.925 |
| 0.7006944444444444 | 372.972 |
| 0.7013888888888888 | 369.291 |
| 0.7020833333333334 | 365.635 |
| 0.7027777777777778 | 360.798 |
| 0.7034722222222222 | 355.999 |
| 0.7041666666666666 | 350.049 |
| 0.7048611111111112 | 338.278 |
| 0.7055555555555556 | 325.473 |
| 0.7062499999999999 | 325.473 |
| 0.7069444444444444 | 320.84 |
| 0.7076388888888889 | 320.84 |
| 0.7083333333333334 | 306.974 |
| 0.7090277777777777 | 296.571 |
| 0.7097222222222223 | 289.616 |
| 0.7104166666666667 | 282.637 |
| 0.7111111111111111 | 281.471 |
| 0.7118055555555555 | 279.136 |
| 0.7125 | 273.281 |
| 0.7131944444444445 | 266.216 |
| 0.7138888888888889 | 259.104 |
| 0.7145833333333332 | 255.528 |
| 0.7152777777777778 | 249.538 |
| 0.7159722222222222 | 242.296 |
| 0.7166666666666667 | 234.99 |
| 0.717361111111111 | 228.852 |
| 0.7180555555555556 | 221.422 |
| 0.71875 | 213.921 |
| 0.7194444444444444 | 207.615 |
| 0.720138888888889 | 201.258 |
| 0.7208333333333333 | 193.561 |
| 0.7215277777777778 | 187.091 |
| 0.7222222222222222 | 180.569 |
| 0.7229166666666668 | 173.996 |
| 0.7236111111111111 | 166.044 |
| 0.7243055555555555 | 159.364 |
| 0.725 | 151.286 |
| 0.7256944444444445 | 141.782 |
| 0.7263888888888889 | 134.943 |
| 0.7270833333333333 | 126.685 |
| 0.7277777777777777 | 118.378 |
| 0.7284722222222223 | 111.42 |
| 0.7291666666666666 | 103.035 |
| 0.7298611111111111 | 96.022 |
| 0.7305555555555556 | 88.991 |
| 0.7312500000000001 | 81.946 |
| 0.7319444444444444 | 74.892 |
| 0.7326388888888888 | 67.835 |
| 0.7333333333333334 | 62.189 |
| 0.7340277777777778 | 56.548 |
| 0.7347222222222222 | 50.914 |
| 0.7354166666666666 | 46.695 |
| 0.7361111111111112 | 42.483 |
| 0.7368055555555556 | 36.881 |
| 0.7374999999999999 | 34.086 |
| 0.7381944444444444 | 29.905 |
| 0.7388888888888889 | 25.736 |
| 0.7395833333333334 | 22.965 |
| 0.7402777777777777 | 20.201 |
| 0.7409722222222223 | 17.444 |
| 0.7416666666666667 | 14.696 |
| 0.7423611111111111 | 11.956 |
| 0.7430555555555555 | 10.589 |
| 0.74375 | 7.862 |
| 0.7444444444444445 | 6.503 |
| 0.7451388888888889 | 5.146 |
| 0.7458333333333332 | 5.146 |
| 0.7465277777777778 | 3.791 |
| 0.7472222222222222 | 2.439 |
| 0.7479166666666667 | 2.439 |
| 0.748611111111111 | 1.09 |
| 0.7493055555555556 | 1.09 |
| 0.75 | 1.09 |
| 0.7506944444444444 | -0.256 |
| 0.751388888888889 | -0.256 |
| 0.7520833333333333 | -0.256 |
| 0.7527777777777778 | -0.256 |
| 0.7534722222222222 | -0.256 |
| 0.7541666666666668 | -0.256 |
| 0.7548611111111111 | -0.256 |
| 0.7555555555555555 | -0.256 |
| 0.75625 | -0.256 |
| 0.7569444444444445 | -0.256 |
| 0.7576388888888889 | -0.256 |
| 0.7583333333333333 | -0.256 |
| 0.7590277777777777 | -0.256 |
| 0.7597222222222223 | -0.256 |
| 0.7604166666666666 | -0.256 |
| 0.7611111111111111 | -0.256 |
| 0.7618055555555556 | -0.256 |
| 0.7625000000000001 | -0.256 |
| 0.7631944444444444 | -0.256 |
| 0.7638888888888888 | -0.256 |
| 0.7645833333333334 | -0.256 |
| 0.7652777777777778 | -0.256 |
| 0.7659722222222222 | -0.256 |
| 0.7666666666666666 | -0.256 |
| 0.7673611111111112 | -0.256 |
| 0.7680555555555556 | -0.256 |
| 0.7687499999999999 | -0.256 |
| 0.7694444444444444 | -0.256 |
| 0.7701388888888889 | -0.256 |
| 0.7708333333333334 | -0.256 |
| 0.7715277777777777 | -0.256 |
| 0.7722222222222223 | -0.256 |
| 0.7729166666666667 | -0.256 |
| 0.7736111111111111 | -0.256 |
| 0.7743055555555555 | -0.256 |
| 0.775 | -0.256 |
| 0.7756944444444445 | -0.256 |
| 0.7763888888888889 | -0.256 |
| 0.7770833333333332 | -0.256 |
| 0.7777777777777778 | -0.256 |
| 0.7784722222222222 | -0.256 |
| 0.7791666666666667 | -0.256 |
| 0.779861111111111 | -0.256 |
| 0.7805555555555556 | -0.256 |
| 0.78125 | -0.256 |
| 0.7819444444444444 | -0.256 |
| 0.782638888888889 | -0.256 |
| 0.7833333333333333 | -0.256 |
| 0.7840277777777778 | -0.256 |
| 0.7847222222222222 | -0.256 |
| 0.7854166666666668 | -0.256 |
| 0.7861111111111111 | -0.256 |
| 0.7868055555555555 | -0.256 |
| 0.7875 | -0.256 |
| 0.7881944444444445 | -0.256 |
| 0.7888888888888889 | -0.256 |
| 0.7895833333333333 | -0.256 |
| 0.7902777777777777 | -0.256 |
| 0.7909722222222223 | -0.256 |
| 0.7916666666666666 | -0.256 |
| 0.7923611111111111 | -0.256 |
| 0.7930555555555556 | -0.256 |
| 0.7937500000000001 | -0.256 |
| 0.7944444444444444 | -0.256 |
| 0.7951388888888888 | -0.256 |
| 0.7958333333333334 | -0.256 |
| 0.7965277777777778 | -0.256 |
| 0.7972222222222222 | -0.256 |
| 0.7979166666666666 | -0.256 |
| 0.7986111111111112 | -0.256 |
| 0.7993055555555556 | -0.256 |
| 0.7999999999999999 | -0.256 |
| 0.8006944444444444 | -0.256 |
| 0.8013888888888889 | -0.256 |
| 0.8020833333333334 | -0.256 |
| 0.8027777777777777 | -0.256 |
| 0.8034722222222223 | -0.256 |
| 0.8041666666666667 | -0.256 |
| 0.8048611111111111 | -0.256 |
| 0.8055555555555555 | -0.256 |
| 0.80625 | -0.256 |
| 0.8069444444444445 | -0.256 |
| 0.8076388888888889 | -0.256 |
| 0.8083333333333332 | -0.256 |
| 0.8090277777777778 | -0.256 |
| 0.8097222222222222 | -0.256 |
| 0.8104166666666667 | -0.256 |
| 0.811111111111111 | -0.256 |
| 0.8118055555555556 | -0.256 |
| 0.8125 | -0.256 |
| 0.8131944444444444 | -0.256 |
| 0.813888888888889 | -0.256 |
| 0.8145833333333333 | -0.256 |
| 0.8152777777777778 | -0.256 |
| 0.8159722222222222 | -0.256 |
| 0.8166666666666668 | -0.256 |
| 0.8173611111111111 | -0.256 |
| 0.8180555555555555 | -0.256 |
| 0.81875 | -0.256 |
| 0.8194444444444445 | -0.256 |
| 0.8201388888888889 | -0.256 |
| 0.8208333333333333 | -0.256 |
| 0.8215277777777777 | -0.256 |
| 0.8222222222222223 | -0.256 |
| 0.8229166666666666 | -0.256 |
| 0.8236111111111111 | -0.256 |
| 0.8243055555555556 | -0.256 |
| 0.8250000000000001 | -0.256 |
| 0.8256944444444444 | -0.256 |
| 0.8263888888888888 | -0.256 |
| 0.8270833333333334 | -0.256 |
| 0.8277777777777778 | -0.256 |
| 0.8284722222222222 | -0.256 |
| 0.8291666666666666 | -0.256 |
| 0.8298611111111112 | -0.256 |
| 0.8305555555555556 | -0.256 |
| 0.8312499999999999 | -0.256 |
| 0.8319444444444444 | -0.256 |
| 0.8326388888888889 | -0.256 |
| 0.8333333333333334 | -0.256 |
| 0.8340277777777777 | -0.256 |
| 0.8347222222222223 | -0.256 |
| 0.8354166666666667 | -0.256 |
| 0.8361111111111111 | -0.256 |
| 0.8368055555555555 | -0.256 |
| 0.8375 | -0.256 |
| 0.8381944444444445 | -0.256 |
| 0.8388888888888889 | -0.256 |
| 0.8395833333333332 | -0.256 |
| 0.8402777777777778 | -0.256 |
| 0.8409722222222222 | -0.256 |
| 0.8416666666666667 | -0.256 |
| 0.842361111111111 | -0.256 |
| 0.8430555555555556 | -0.256 |
| 0.84375 | -0.256 |
| 0.8444444444444444 | -0.256 |
| 0.845138888888889 | -0.256 |
| 0.8458333333333333 | -0.256 |
| 0.8465277777777778 | -0.256 |
| 0.8472222222222222 | -0.256 |
| 0.8479166666666668 | -0.256 |
| 0.8486111111111111 | -0.256 |
| 0.8493055555555555 | -0.256 |
| 0.85 | -0.256 |
| 0.8506944444444445 | -0.256 |
| 0.8513888888888889 | -0.256 |
| 0.8520833333333333 | -0.256 |
| 0.8527777777777777 | -0.256 |
| 0.8534722222222223 | -0.256 |
| 0.8541666666666666 | -0.256 |
| 0.8548611111111111 | -0.256 |
| 0.8555555555555556 | -0.256 |
| 0.8562500000000001 | -0.256 |
| 0.8569444444444444 | -0.256 |
| 0.8576388888888888 | -0.256 |
| 0.8583333333333334 | -0.256 |
| 0.8590277777777778 | -0.256 |
| 0.8597222222222222 | -0.256 |
| 0.8604166666666666 | -0.256 |
| 0.8611111111111112 | -0.256 |
| 0.8618055555555556 | -0.256 |
| 0.8624999999999999 | -0.256 |
| 0.8631944444444444 | -0.256 |
| 0.8638888888888889 | -0.256 |
| 0.8645833333333334 | -0.256 |
| 0.8652777777777777 | -0.256 |
| 0.8659722222222223 | -0.256 |
| 0.8666666666666667 | -0.256 |
| 0.8673611111111111 | -0.256 |
| 0.8680555555555555 | -0.256 |
| 0.86875 | -0.256 |
| 0.8694444444444445 | -0.256 |
| 0.8701388888888889 | -0.256 |
| 0.8708333333333332 | -0.256 |
| 0.8715277777777778 | -0.256 |
| 0.8722222222222222 | -0.256 |
| 0.8729166666666667 | -0.256 |
| 0.873611111111111 | -0.256 |
| 0.8743055555555556 | -0.256 |
| 0.875 | -0.256 |
| 0.8756944444444444 | -0.256 |
| 0.876388888888889 | -0.256 |
| 0.8770833333333333 | -0.256 |
| 0.8777777777777778 | -0.256 |
| 0.8784722222222222 | -0.256 |
| 0.8791666666666668 | -0.256 |
| 0.8798611111111111 | -0.256 |
| 0.8805555555555555 | -0.256 |
| 0.88125 | -0.256 |
| 0.8819444444444445 | -0.256 |
| 0.8826388888888889 | -0.256 |
| 0.8833333333333333 | -0.256 |
| 0.8840277777777777 | -0.256 |
| 0.8847222222222223 | -0.256 |
| 0.8854166666666666 | -0.256 |
| 0.8861111111111111 | -0.256 |
| 0.8868055555555556 | -0.256 |
| 0.8875000000000001 | -0.256 |
| 0.8881944444444444 | -0.256 |
| 0.8888888888888888 | -0.256 |
| 0.8895833333333334 | -0.256 |
| 0.8902777777777778 | -0.256 |
| 0.8909722222222222 | -0.256 |
| 0.8916666666666666 | -0.256 |
| 0.8923611111111112 | -0.256 |
| 0.8930555555555556 | -0.256 |
| 0.8937499999999999 | -0.256 |
| 0.8944444444444444 | -0.256 |
| 0.8951388888888889 | -0.256 |
| 0.8958333333333334 | -0.256 |
| 0.8965277777777777 | -0.256 |
| 0.8972222222222223 | -0.256 |
| 0.8979166666666667 | -0.256 |
| 0.8986111111111111 | -0.256 |
| 0.8993055555555555 | -0.256 |
| 0.9 | -0.256 |
| 0.9006944444444445 | -0.256 |
| 0.9013888888888889 | -0.256 |
| 0.9020833333333332 | -0.256 |
| 0.9027777777777778 | -0.256 |
| 0.9034722222222222 | -0.256 |
| 0.9041666666666667 | -0.256 |
| 0.904861111111111 | -0.256 |
| 0.9055555555555556 | -0.256 |
| 0.90625 | -0.256 |
| 0.9069444444444444 | -0.256 |
| 0.907638888888889 | -0.256 |
| 0.9083333333333333 | -0.256 |
| 0.9090277777777778 | -0.256 |
| 0.9097222222222222 | -0.256 |
| 0.9104166666666668 | -0.256 |
| 0.9111111111111111 | -0.256 |
| 0.9118055555555555 | -0.256 |
| 0.9125 | -0.256 |
| 0.9131944444444445 | -0.256 |
| 0.9138888888888889 | -0.256 |
| 0.9145833333333333 | -0.256 |
| 0.9152777777777777 | -0.256 |
| 0.9159722222222223 | -0.256 |
| 0.9166666666666666 | -0.256 |
| 0.9173611111111111 | -0.256 |
| 0.9180555555555556 | -0.256 |
| 0.9187500000000001 | -0.256 |
| 0.9194444444444444 | -0.256 |
| 0.9201388888888888 | -0.256 |
| 0.9208333333333334 | -0.256 |
| 0.9215277777777778 | -0.256 |
| 0.9222222222222222 | -0.256 |
| 0.9229166666666666 | -0.256 |
| 0.9236111111111112 | -0.256 |
| 0.9243055555555556 | -0.256 |
| 0.9249999999999999 | -0.256 |
| 0.9256944444444444 | -0.256 |
| 0.9263888888888889 | -0.256 |
| 0.9270833333333334 | -0.256 |
| 0.9277777777777777 | -0.256 |
| 0.9284722222222223 | -0.256 |
| 0.9291666666666667 | -0.256 |
| 0.9298611111111111 | -0.256 |
| 0.9305555555555555 | -0.256 |
| 0.93125 | -0.256 |
| 0.9319444444444445 | -0.256 |
| 0.9326388888888889 | -0.256 |
| 0.9333333333333332 | -0.256 |
| 0.9340277777777778 | -0.256 |
| 0.9347222222222222 | -0.256 |
| 0.9354166666666667 | -0.256 |
| 0.936111111111111 | -0.256 |
| 0.9368055555555556 | -0.256 |
| 0.9375 | -0.256 |
| 0.9381944444444444 | -0.256 |
| 0.938888888888889 | -0.256 |
| 0.9395833333333333 | -0.256 |
| 0.9402777777777778 | -0.256 |
| 0.9409722222222222 | -0.256 |
| 0.9416666666666668 | -0.256 |
| 0.9423611111111111 | -0.256 |
| 0.9430555555555555 | -0.256 |
| 0.94375 | -0.256 |
| 0.9444444444444445 | -0.256 |
| 0.9451388888888889 | -0.256 |
| 0.9458333333333333 | -0.256 |
| 0.9465277777777777 | -0.256 |
| 0.9472222222222223 | -0.256 |
| 0.9479166666666666 | -0.256 |
| 0.9486111111111111 | -0.256 |
| 0.9493055555555556 | -0.256 |
| 0.9500000000000001 | -0.256 |
| 0.9506944444444444 | -0.256 |
| 0.9513888888888888 | -0.256 |
| 0.9520833333333334 | -0.256 |
| 0.9527777777777778 | -0.256 |
| 0.9534722222222222 | -0.256 |
| 0.9541666666666666 | -0.256 |
| 0.9548611111111112 | -0.256 |
| 0.9555555555555556 | -0.256 |
| 0.9562499999999999 | -0.256 |
| 0.9569444444444444 | -0.256 |
| 0.9576388888888889 | -0.256 |
| 0.9583333333333334 | -0.256 |
| 0.9590277777777777 | -0.256 |
| 0.9597222222222223 | -0.256 |
| 0.9604166666666667 | -0.256 |
| 0.9611111111111111 | -0.256 |
| 0.9618055555555555 | -0.256 |
| 0.9625 | -0.256 |
| 0.9631944444444445 | -0.256 |
| 0.9638888888888889 | -0.256 |
| 0.9645833333333332 | -0.256 |
| 0.9652777777777778 | -0.256 |
| 0.9659722222222222 | -0.256 |
| 0.9666666666666667 | -0.256 |
| 0.967361111111111 | -0.256 |
| 0.9680555555555556 | -0.256 |
| 0.96875 | -0.256 |
| 0.9694444444444444 | -0.256 |
| 0.970138888888889 | -0.256 |
| 0.9708333333333333 | -0.256 |
| 0.9715277777777778 | -0.256 |
| 0.9722222222222222 | -0.256 |
| 0.9729166666666668 | -0.256 |
| 0.9736111111111111 | -0.256 |
| 0.9743055555555555 | -0.256 |
| 0.975 | -0.256 |
| 0.9756944444444445 | -0.256 |
| 0.9763888888888889 | -0.256 |
| 0.9770833333333333 | -0.256 |
| 0.9777777777777777 | -0.256 |
| 0.9784722222222223 | -0.256 |
| 0.9791666666666666 | -0.256 |
| 0.9798611111111111 | -0.256 |
| 0.9805555555555556 | -0.256 |
| 0.9812500000000001 | -0.256 |
| 0.9819444444444444 | -0.256 |
| 0.9826388888888888 | -0.256 |
| 0.9833333333333334 | -0.256 |
| 0.9840277777777778 | -0.256 |
| 0.9847222222222222 | -0.256 |
| 0.9854166666666666 | -0.256 |
| 0.9861111111111112 | -0.256 |
| 0.9868055555555556 | -0.256 |
| 0.9874999999999999 | -0.256 |
| 0.9881944444444444 | -0.256 |
| 0.9888888888888889 | -0.256 |
| 0.9895833333333334 | -0.256 |
| 0.9902777777777777 | -0.256 |
| 0.9909722222222223 | -0.256 |
| 0.9916666666666667 | -0.256 |
| 0.9923611111111111 | -0.256 |
| 0.9930555555555555 | -0.256 |
| 0.99375 | -0.256 |
| 0.9944444444444445 | -0.256 |
| 0.9951388888888889 | -0.256 |
| 0.9958333333333332 | -0.256 |
| 0.9965277777777778 | -0.256 |
| 0.9972222222222222 | -0.256 |
| 0.9979166666666667 | -0.256 |
| 0.998611111111111 | -0.256 |
| 0.9993055555555556 | 0 |